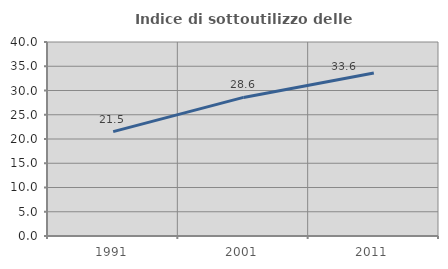
| Category | Indice di sottoutilizzo delle abitazioni  |
|---|---|
| 1991.0 | 21.524 |
| 2001.0 | 28.576 |
| 2011.0 | 33.596 |